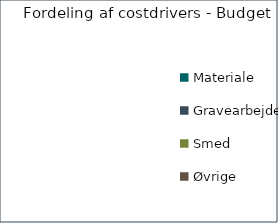
| Category | Series 0 | Andel af budget  |
|---|---|---|
| Materiale  |  | 0 |
| Gravearbejde |  | 0 |
| Smed |  | 0 |
| Øvrige  |  | 0 |